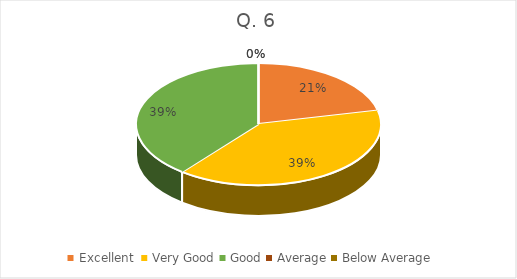
| Category | Series 0 |
|---|---|
| Excellent  | 30 |
| Very Good | 55 |
| Good | 55 |
| Average | 0 |
| Below Average | 0 |